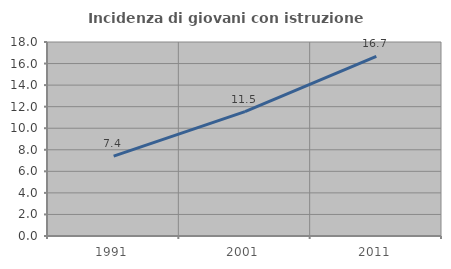
| Category | Incidenza di giovani con istruzione universitaria |
|---|---|
| 1991.0 | 7.407 |
| 2001.0 | 11.538 |
| 2011.0 | 16.667 |